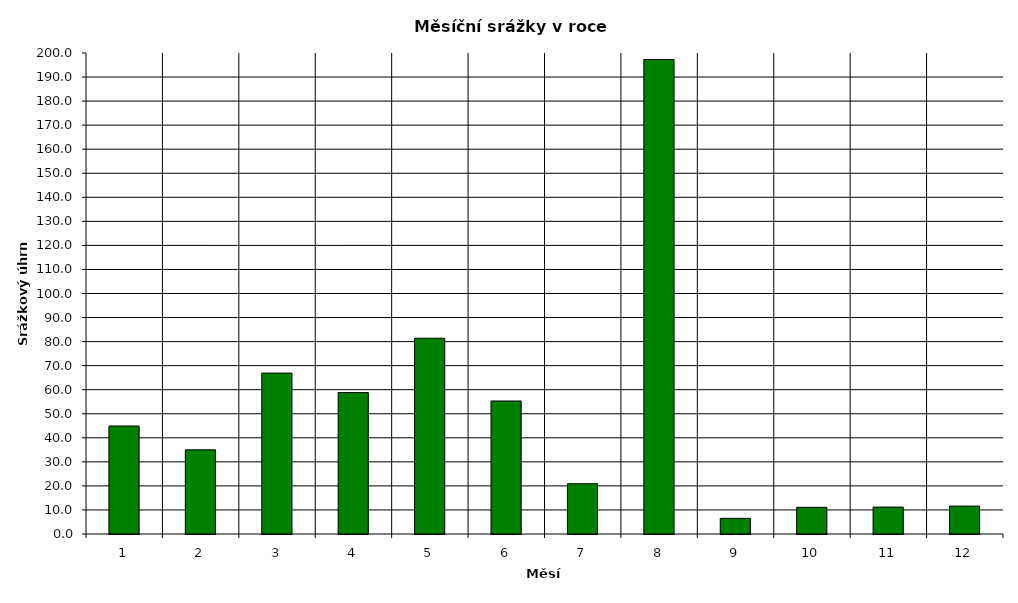
| Category | Series 0 |
|---|---|
| 0 | 44.9 |
| 1 | 35 |
| 2 | 66.9 |
| 3 | 58.8 |
| 4 | 81.4 |
| 5 | 55.3 |
| 6 | 20.9 |
| 7 | 197.3 |
| 8 | 6.5 |
| 9 | 11.1 |
| 10 | 11.2 |
| 11 | 11.6 |